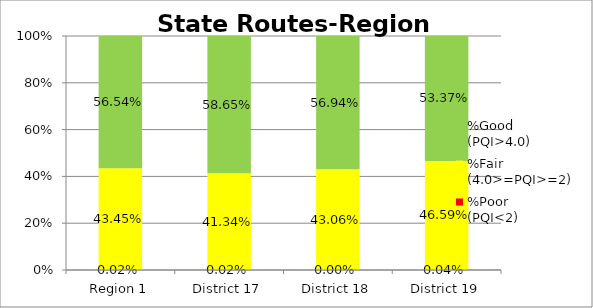
| Category | %Poor
(PQI<2) | %Fair
(4.0>=PQI>=2) | %Good
(PQI>4.0) |
|---|---|---|---|
| Region 1 | 0 | 0.434 | 0.565 |
| District 17 | 0 | 0.413 | 0.586 |
| District 18 | 0 | 0.431 | 0.569 |
| District 19 | 0 | 0.466 | 0.534 |